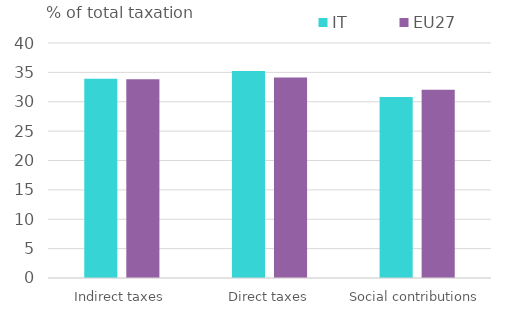
| Category | IT | EU27 |
|---|---|---|
| Indirect taxes | 33.933 | 33.811 |
| Direct taxes | 35.245 | 34.133 |
| Social contributions | 30.822 | 32.056 |